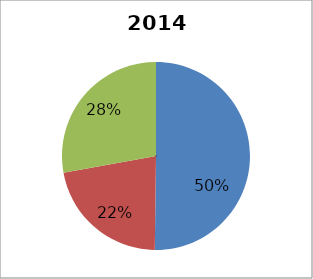
| Category | 2012 Breakdown |
|---|---|
| Technical Analysis | 0.502 |
| Tool Development, Research, Regional Coordination  | 0.22 |
| Administration | 0.278 |